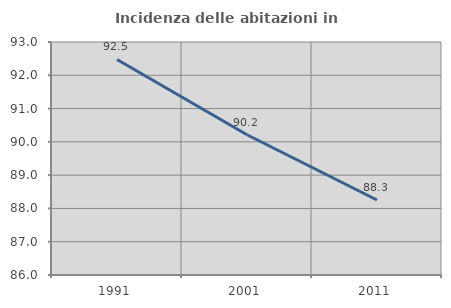
| Category | Incidenza delle abitazioni in proprietà  |
|---|---|
| 1991.0 | 92.476 |
| 2001.0 | 90.214 |
| 2011.0 | 88.253 |